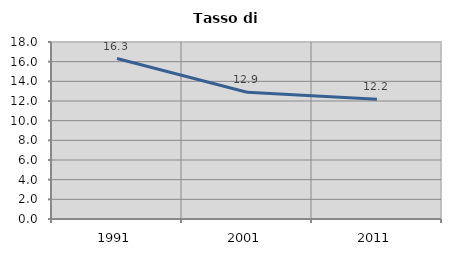
| Category | Tasso di disoccupazione   |
|---|---|
| 1991.0 | 16.318 |
| 2001.0 | 12.882 |
| 2011.0 | 12.17 |